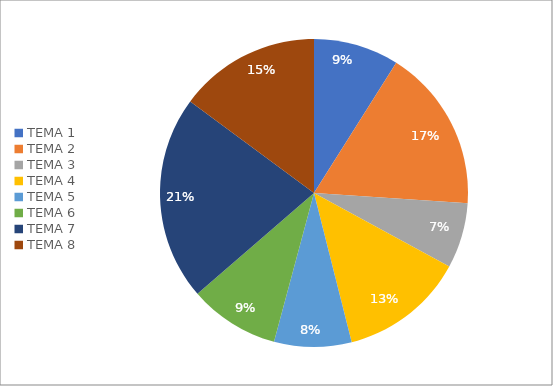
| Category | Series 0 | Series 1 |
|---|---|---|
| TEMA 1 | 0.09 | 0.09 |
| TEMA 2 | 0.171 | 0.171 |
| TEMA 3 | 0.069 | 0.069 |
| TEMA 4 | 0.131 | 0.131 |
| TEMA 5 | 0.081 | 0.081 |
| TEMA 6 | 0.095 | 0.095 |
| TEMA 7 | 0.215 | 0.215 |
| TEMA 8 | 0.149 | 0.149 |